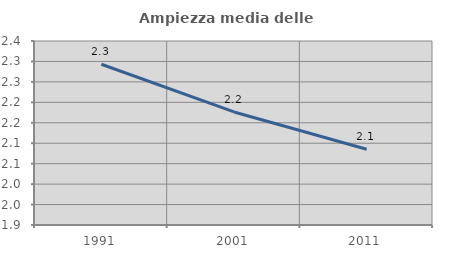
| Category | Ampiezza media delle famiglie |
|---|---|
| 1991.0 | 2.293 |
| 2001.0 | 2.176 |
| 2011.0 | 2.085 |